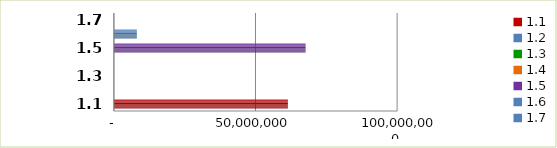
| Category | Series 0 |
|---|---|
| 1.1 | 61434787 |
| 1.2 | 0 |
| 1.3 | 0 |
| 1.4 | 0 |
| 1.5 | 67676283.562 |
| 1.6 | 8099514 |
| 1.7 | 0 |